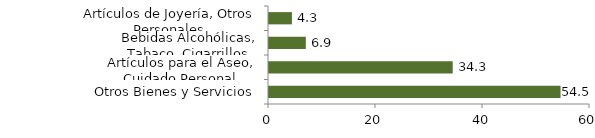
| Category | Otros grupos |
|---|---|
| Otros Bienes y Servicios | 54.495 |
| Artículos para el Aseo, Cuidado Personal | 34.337 |
| Bebidas Alcohólicas, Tabaco, Cigarrillos | 6.883 |
| Artículos de Joyería, Otros Personales | 4.285 |